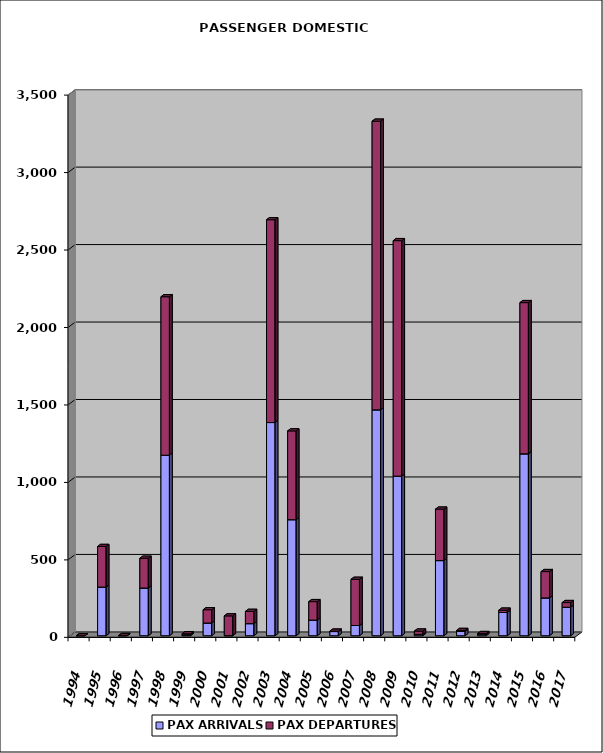
| Category | PAX ARRIVALS | PAX DEPARTURES |
|---|---|---|
| 1994.0 | 0 | 0 |
| 1995.0 | 314 | 262 |
| 1996.0 | 1 | 0 |
| 1997.0 | 308 | 192 |
| 1998.0 | 1165 | 1023 |
| 1999.0 | 6 | 7 |
| 2000.0 | 82 | 86 |
| 2001.0 | 1 | 127 |
| 2002.0 | 78 | 79 |
| 2003.0 | 1376 | 1309 |
| 2004.0 | 749 | 573 |
| 2005.0 | 101 | 119 |
| 2006.0 | 27 | 2 |
| 2007.0 | 66 | 298 |
| 2008.0 | 1458 | 1863 |
| 2009.0 | 1030 | 1520 |
| 2010.0 | 9 | 21 |
| 2011.0 | 485 | 332 |
| 2012.0 | 28 | 6 |
| 2013.0 | 11 | 3 |
| 2014.0 | 150 | 15 |
| 2015.0 | 1174 | 976 |
| 2016.0 | 244 | 170 |
| 2017.0 | 184 | 30 |